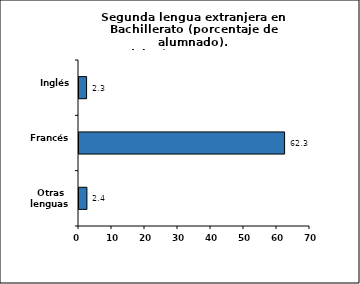
| Category | Series 0 |
|---|---|
| Inglés | 2.3 |
| Francés | 62.3 |
| Otras lenguas | 2.4 |